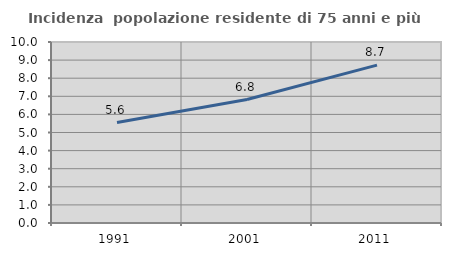
| Category | Incidenza  popolazione residente di 75 anni e più |
|---|---|
| 1991.0 | 5.552 |
| 2001.0 | 6.823 |
| 2011.0 | 8.725 |